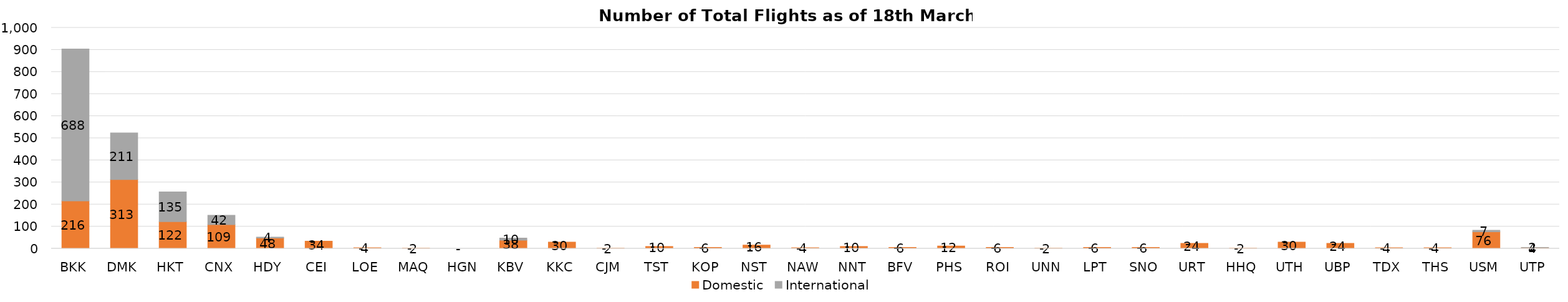
| Category | Domestic | International |
|---|---|---|
| BKK | 216 | 688 |
| DMK | 313 | 211 |
| HKT | 122 | 135 |
| CNX | 109 | 42 |
| HDY | 48 | 4 |
| CEI | 34 | 0 |
| LOE | 4 | 0 |
| MAQ | 2 | 0 |
| HGN | 0 | 0 |
| KBV | 38 | 10 |
| KKC | 30 | 0 |
| CJM | 2 | 0 |
| TST | 10 | 0 |
| KOP | 6 | 0 |
| NST | 16 | 0 |
| NAW | 4 | 0 |
| NNT | 10 | 0 |
| BFV | 6 | 0 |
| PHS | 12 | 0 |
| ROI | 6 | 0 |
| UNN | 2 | 0 |
| LPT | 6 | 0 |
| SNO | 6 | 0 |
| URT | 24 | 0 |
| HHQ | 2 | 0 |
| UTH | 30 | 0 |
| UBP | 24 | 0 |
| TDX | 4 | 0 |
| THS | 4 | 0 |
| USM | 76 | 7 |
| UTP | 4 | 2 |